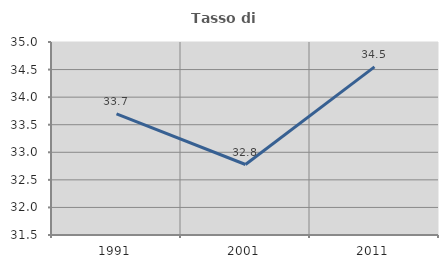
| Category | Tasso di occupazione   |
|---|---|
| 1991.0 | 33.697 |
| 2001.0 | 32.778 |
| 2011.0 | 34.549 |